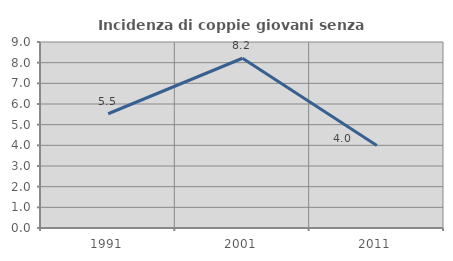
| Category | Incidenza di coppie giovani senza figli |
|---|---|
| 1991.0 | 5.528 |
| 2001.0 | 8.214 |
| 2011.0 | 3.991 |